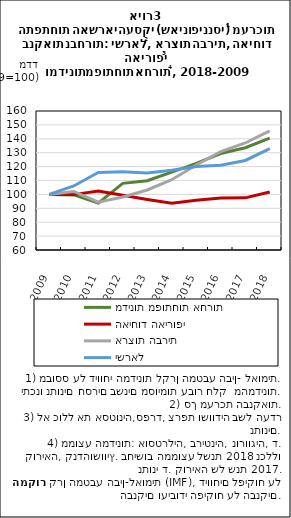
| Category | מדינות מפותחות אחרות | האיחוד האירופי | ארצות הברית | ישראל |
|---|---|---|---|---|
| 2009.0 | 100 | 100 | 100 | 100 |
| 2010.0 | 99.645 | 99.842 | 102.142 | 106.064 |
| 2011.0 | 93.765 | 102.435 | 94.369 | 115.736 |
| 2012.0 | 107.957 | 99.316 | 98.182 | 116.341 |
| 2013.0 | 109.831 | 96.346 | 103.193 | 115.373 |
| 2014.0 | 116.039 | 93.708 | 110.574 | 117.438 |
| 2015.0 | 122.355 | 95.71 | 121.2 | 120.111 |
| 2016.0 | 129.384 | 97.33 | 130.728 | 120.955 |
| 2017.0 | 133.562 | 97.525 | 136.986 | 124.42 |
| 2018.0 | 140.506 | 101.71 | 145.722 | 132.866 |